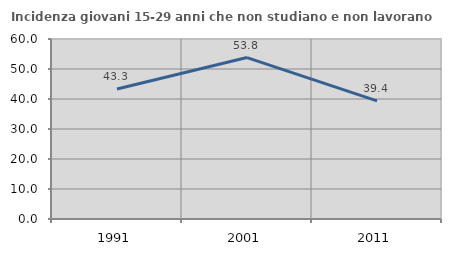
| Category | Incidenza giovani 15-29 anni che non studiano e non lavorano  |
|---|---|
| 1991.0 | 43.333 |
| 2001.0 | 53.814 |
| 2011.0 | 39.399 |